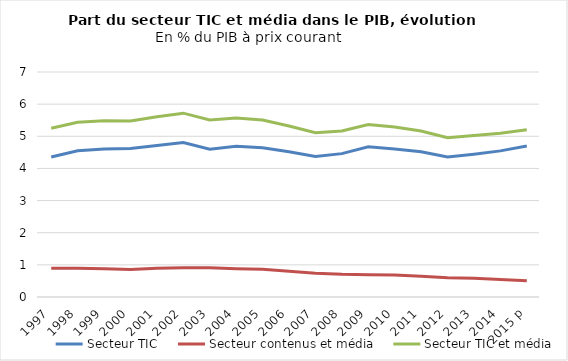
| Category | Secteur TIC | Secteur contenus et média | Secteur TIC et média |
|---|---|---|---|
| 1997 | 4.355 | 0.894 | 5.249 |
| 1998 | 4.547 | 0.891 | 5.438 |
| 1999 | 4.606 | 0.876 | 5.483 |
| 2000 | 4.62 | 0.853 | 5.474 |
| 2001 | 4.715 | 0.894 | 5.61 |
| 2002 | 4.806 | 0.913 | 5.72 |
| 2003 | 4.597 | 0.908 | 5.505 |
| 2004 | 4.692 | 0.88 | 5.572 |
| 2005 | 4.645 | 0.864 | 5.508 |
| 2006 | 4.52 | 0.798 | 5.318 |
| 2007 | 4.371 | 0.74 | 5.111 |
| 2008 | 4.46 | 0.705 | 5.165 |
| 2009 | 4.676 | 0.693 | 5.369 |
| 2010 | 4.603 | 0.686 | 5.289 |
| 2011 | 4.52 | 0.645 | 5.164 |
| 2012 | 4.356 | 0.601 | 4.957 |
| 2013 | 4.442 | 0.583 | 5.025 |
| 2014 | 4.546 | 0.548 | 5.095 |
| 2015 p | 4.699 | 0.504 | 5.203 |